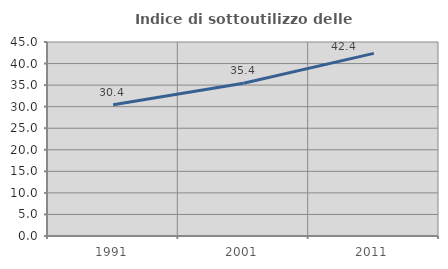
| Category | Indice di sottoutilizzo delle abitazioni  |
|---|---|
| 1991.0 | 30.443 |
| 2001.0 | 35.444 |
| 2011.0 | 42.358 |